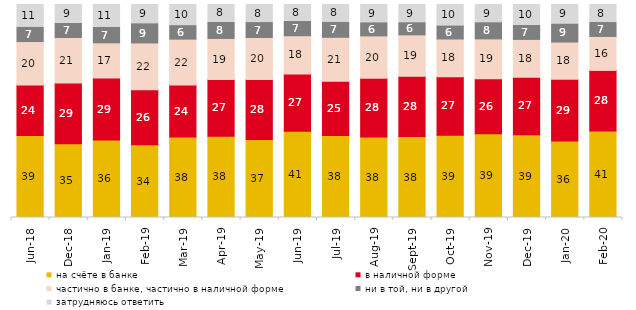
| Category | на счёте в банке | в наличной форме | частично в банке, частично в наличной форме | ни в той, ни в другой | затрудняюсь ответить |
|---|---|---|---|---|---|
| 2018-06-01 | 38.5 | 23.65 | 20.45 | 6.8 | 10.6 |
| 2018-12-01 | 34.6 | 28.55 | 21.35 | 6.65 | 8.85 |
| 2019-01-01 | 36.35 | 29.1 | 16.55 | 7.35 | 10.65 |
| 2019-02-01 | 34.2 | 25.75 | 22 | 9.05 | 9 |
| 2019-03-01 | 37.842 | 24.316 | 21.581 | 6.365 | 9.896 |
| 2019-04-01 | 38.119 | 26.634 | 19.307 | 7.574 | 8.366 |
| 2019-05-01 | 36.652 | 28.083 | 19.762 | 7.033 | 8.47 |
| 2019-06-01 | 40.549 | 26.833 | 17.955 | 6.733 | 7.93 |
| 2019-07-01 | 38.465 | 25.495 | 20.644 | 7.129 | 8.267 |
| 2019-08-01 | 37.812 | 27.522 | 19.93 | 6.194 | 8.541 |
| 2019-09-01 | 37.97 | 28.366 | 19.406 | 5.743 | 8.515 |
| 2019-10-01 | 38.663 | 27.426 | 17.723 | 6.188 | 10 |
| 2019-11-01 | 39.356 | 25.792 | 18.713 | 7.624 | 8.515 |
| 2019-12-01 | 38.812 | 27.079 | 17.723 | 6.535 | 9.851 |
| 2020-01-01 | 35.941 | 28.911 | 17.525 | 8.515 | 9.109 |
| 2020-02-01 | 40.644 | 28.416 | 15.941 | 6.535 | 8.465 |